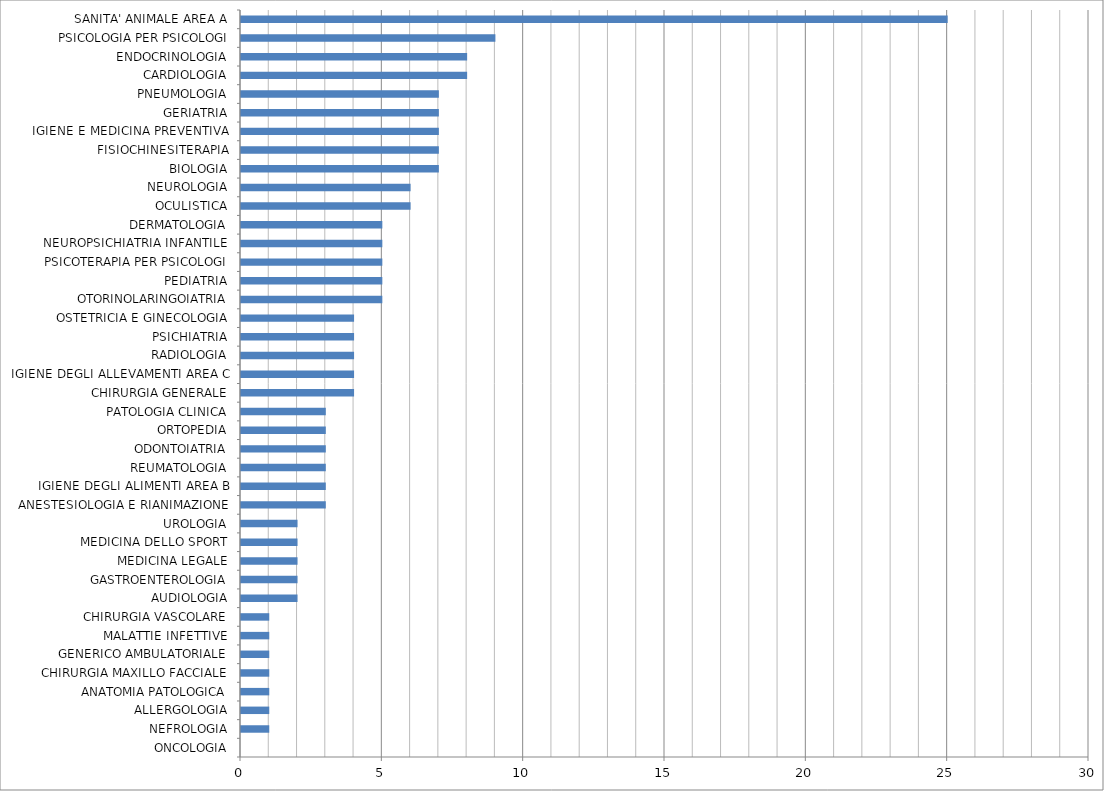
| Category | Series 0 |
|---|---|
| ONCOLOGIA | 0 |
| NEFROLOGIA | 1 |
| ALLERGOLOGIA | 1 |
| ANATOMIA PATOLOGICA | 1 |
| CHIRURGIA MAXILLO FACCIALE | 1 |
| GENERICO AMBULATORIALE | 1 |
| MALATTIE INFETTIVE | 1 |
| CHIRURGIA VASCOLARE | 1 |
| AUDIOLOGIA | 2 |
| GASTROENTEROLOGIA | 2 |
| MEDICINA LEGALE | 2 |
| MEDICINA DELLO SPORT | 2 |
| UROLOGIA | 2 |
| ANESTESIOLOGIA E RIANIMAZIONE | 3 |
| IGIENE DEGLI ALIMENTI AREA B | 3 |
| REUMATOLOGIA | 3 |
| ODONTOIATRIA | 3 |
| ORTOPEDIA | 3 |
| PATOLOGIA CLINICA | 3 |
| CHIRURGIA GENERALE | 4 |
| IGIENE DEGLI ALLEVAMENTI AREA C | 4 |
| RADIOLOGIA | 4 |
| PSICHIATRIA | 4 |
| OSTETRICIA E GINECOLOGIA | 4 |
| OTORINOLARINGOIATRIA | 5 |
| PEDIATRIA | 5 |
| PSICOTERAPIA PER PSICOLOGI | 5 |
| NEUROPSICHIATRIA INFANTILE | 5 |
| DERMATOLOGIA | 5 |
| OCULISTICA | 6 |
| NEUROLOGIA | 6 |
| BIOLOGIA | 7 |
| FISIOCHINESITERAPIA | 7 |
| IGIENE E MEDICINA PREVENTIVA | 7 |
| GERIATRIA | 7 |
| PNEUMOLOGIA | 7 |
| CARDIOLOGIA | 8 |
| ENDOCRINOLOGIA | 8 |
| PSICOLOGIA PER PSICOLOGI | 9 |
| SANITA' ANIMALE AREA A | 25 |